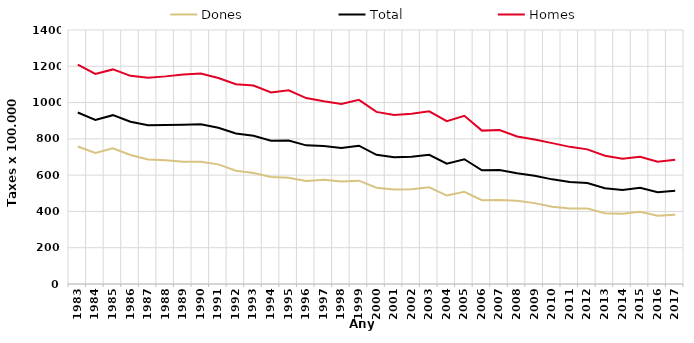
| Category | Dones | Total | Homes |
|---|---|---|---|
| 1983.0 | 757.55 | 945.2 | 1209.33 |
| 1984.0 | 722.5 | 903.77 | 1157.81 |
| 1985.0 | 748.02 | 930.54 | 1182.77 |
| 1986.0 | 710.75 | 894.58 | 1147.18 |
| 1987.0 | 686.43 | 874.76 | 1137.29 |
| 1988.0 | 682.17 | 876.5 | 1144.37 |
| 1989.0 | 673.39 | 877.27 | 1155.14 |
| 1990.0 | 673.55 | 879.86 | 1160.19 |
| 1991.0 | 659.34 | 861.29 | 1135.42 |
| 1992.0 | 623.98 | 829.12 | 1101.2 |
| 1993.0 | 611.62 | 817.24 | 1094.39 |
| 1994.0 | 590.18 | 789.13 | 1056.02 |
| 1995.0 | 585.87 | 791.39 | 1067.49 |
| 1996.0 | 568.31 | 764.13 | 1024.64 |
| 1997.0 | 575.02 | 761.09 | 1006.75 |
| 1998.0 | 564.51 | 749.96 | 992.16 |
| 1999.0 | 569.6 | 762.4 | 1015 |
| 2000.0 | 530.4 | 712.2 | 948.6 |
| 2001.0 | 520.3 | 699 | 931.2 |
| 2002.0 | 522.6 | 701.1 | 938.1 |
| 2003.0 | 532.8 | 712.2 | 952.1 |
| 2004.0 | 487.5 | 663.1 | 897.3 |
| 2005.0 | 508.1 | 687.5 | 927.1 |
| 2006.0 | 461.55 | 626.49 | 845.43 |
| 2007.0 | 462.44 | 628.19 | 848.32 |
| 2008.0 | 458.87 | 610.96 | 812.88 |
| 2009.0 | 445.772 | 597.162 | 796.459 |
| 2010.0 | 425.89 | 576.76 | 776.47 |
| 2011.0 | 416.05 | 562.54 | 755.89 |
| 2012.0 | 415.56 | 556.82 | 742.13 |
| 2013.0 | 389.91 | 527.62 | 706.62 |
| 2014.0 | 386.57 | 518.06 | 689.84 |
| 2015.0 | 398.24 | 530.64 | 701.77 |
| 2016.0 | 376.68 | 505.9 | 673.63 |
| 2017.0 | 381.95 | 514.19 | 685.29 |